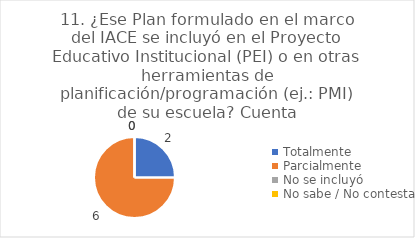
| Category | 11. ¿Ese Plan formulado en el marco del IACE se incluyó en el Proyecto Educativo Institucional (PEI) o en otras herramientas de planificación/programación (ej.: PMI) de su escuela? |
|---|---|
| Totalmente  | 0.25 |
| Parcialmente  | 0.75 |
| No se incluyó  | 0 |
| No sabe / No contesta | 0 |